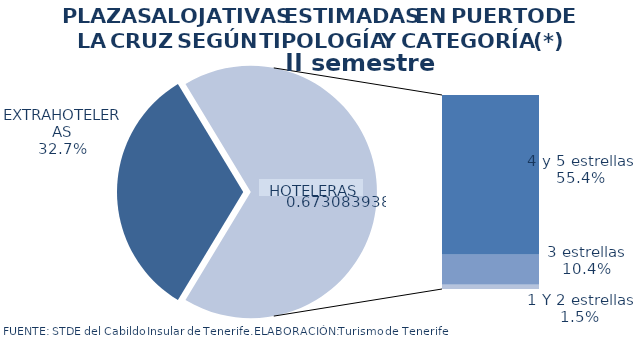
| Category | II semestre 2013 |
|---|---|
| EXTRAHOTELERAS | 0.327 |
| 4 y 5 estrellas | 0.554 |
| 3 estrellas | 0.104 |
| 1 Y 2 estrellas | 0.015 |